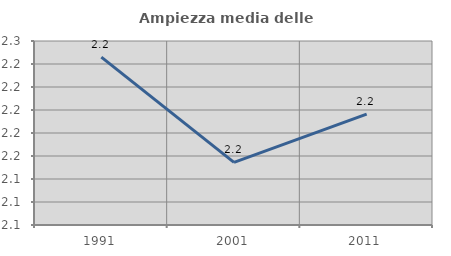
| Category | Ampiezza media delle famiglie |
|---|---|
| 1991.0 | 2.246 |
| 2001.0 | 2.154 |
| 2011.0 | 2.196 |